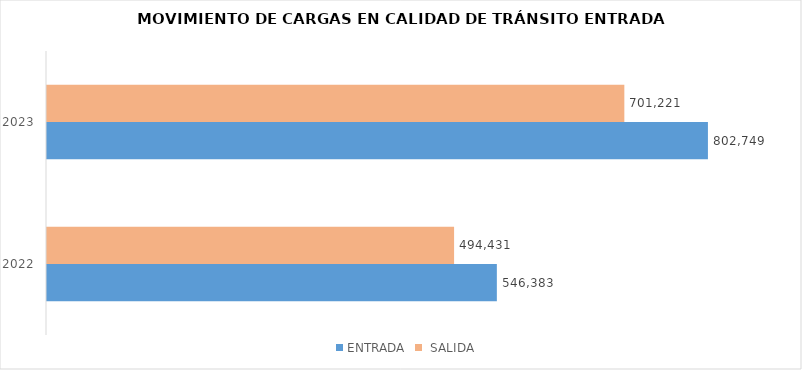
| Category | ENTRADA |  SALIDA |
|---|---|---|
| 2022.0 | 546383 | 494431 |
| 2023.0 | 802749 | 701221 |